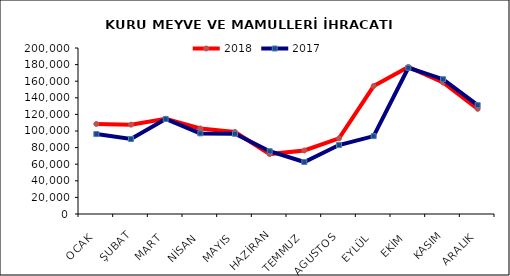
| Category | 2018 | 2017 |
|---|---|---|
| OCAK | 108480.376 | 96308.27 |
| ŞUBAT | 107631.099 | 90329.653 |
| MART | 114743.126 | 114439.776 |
| NİSAN | 103051.375 | 97130.478 |
| MAYIS | 98804.532 | 96648.83 |
| HAZİRAN | 72157.402 | 75691.727 |
| TEMMUZ | 76565.921 | 62661.457 |
| AGUSTOS | 91061.191 | 83044.944 |
| EYLÜL | 154152.753 | 93820.252 |
| EKİM | 177142.051 | 176140.106 |
| KASIM | 158408.241 | 162383.61 |
| ARALIK | 126714.263 | 131136.944 |